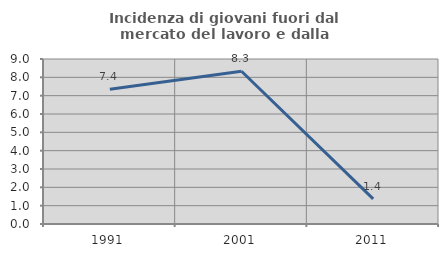
| Category | Incidenza di giovani fuori dal mercato del lavoro e dalla formazione  |
|---|---|
| 1991.0 | 7.353 |
| 2001.0 | 8.333 |
| 2011.0 | 1.37 |